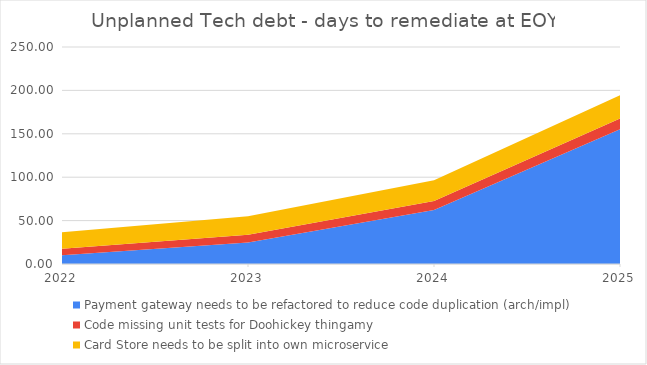
| Category | Payment gateway needs to be refactored to reduce code duplication (arch/impl) | Code missing unit tests for Doohickey thingamy | Card Store needs to be split into own microservice |
|---|---|---|---|
| 2022-12-31 23:59:59 | 9.941 | 7.659 | 18.905 |
| 2023-12-31 23:59:59 | 24.852 | 8.935 | 21.269 |
| 2024-12-31 23:59:59 | 62.131 | 10.424 | 23.927 |
| 2025-12-31 23:59:59 | 155.326 | 12.162 | 26.918 |